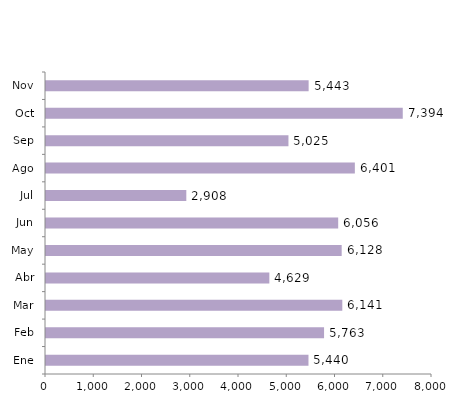
| Category | Series 0 |
|---|---|
| Ene | 5440 |
| Feb | 5763 |
| Mar | 6141 |
| Abr | 4629 |
| May | 6128 |
| Jun | 6056 |
| Jul | 2908 |
| Ago | 6401 |
| Sep | 5025 |
| Oct | 7394 |
| Nov | 5443 |